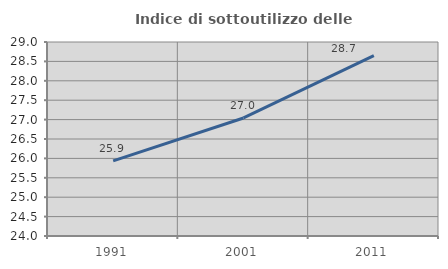
| Category | Indice di sottoutilizzo delle abitazioni  |
|---|---|
| 1991.0 | 25.936 |
| 2001.0 | 27.042 |
| 2011.0 | 28.65 |